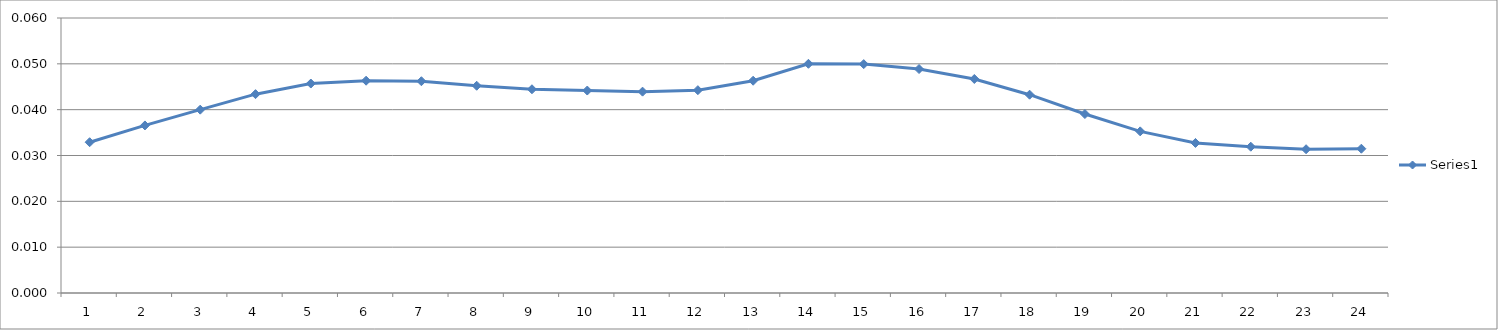
| Category | Series 0 |
|---|---|
| 0 | 0.033 |
| 1 | 0.037 |
| 2 | 0.04 |
| 3 | 0.043 |
| 4 | 0.046 |
| 5 | 0.046 |
| 6 | 0.046 |
| 7 | 0.045 |
| 8 | 0.044 |
| 9 | 0.044 |
| 10 | 0.044 |
| 11 | 0.044 |
| 12 | 0.046 |
| 13 | 0.05 |
| 14 | 0.05 |
| 15 | 0.049 |
| 16 | 0.047 |
| 17 | 0.043 |
| 18 | 0.039 |
| 19 | 0.035 |
| 20 | 0.033 |
| 21 | 0.032 |
| 22 | 0.031 |
| 23 | 0.031 |